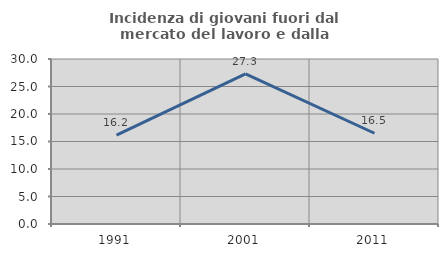
| Category | Incidenza di giovani fuori dal mercato del lavoro e dalla formazione  |
|---|---|
| 1991.0 | 16.16 |
| 2001.0 | 27.293 |
| 2011.0 | 16.499 |